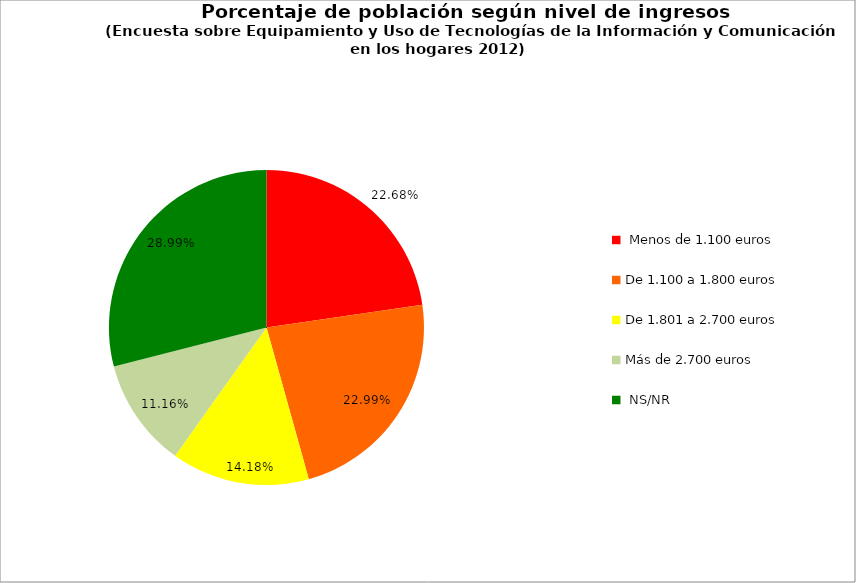
| Category | "Porcentaje de población según nivel de ingresos" |
|---|---|
|  Menos de 1.100 euros | 0.227 |
| De 1.100 a 1.800 euros | 0.23 |
| De 1.801 a 2.700 euros | 0.142 |
| Más de 2.700 euros | 0.112 |
|  NS/NR | 0.29 |